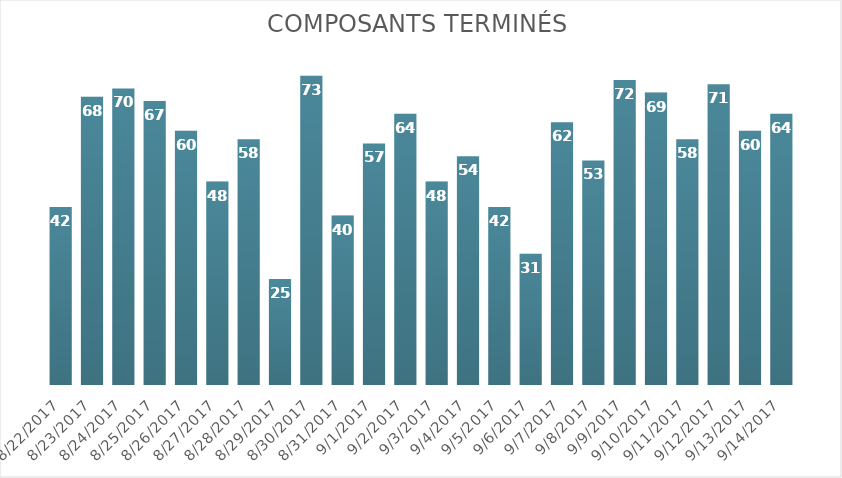
| Category | Composants terminés |
|---|---|
| 8/22/17 | 42 |
| 8/23/17 | 68 |
| 8/24/17 | 70 |
| 8/25/17 | 67 |
| 8/26/17 | 60 |
| 8/27/17 | 48 |
| 8/28/17 | 58 |
| 8/29/17 | 25 |
| 8/30/17 | 73 |
| 8/31/17 | 40 |
| 9/1/17 | 57 |
| 9/2/17 | 64 |
| 9/3/17 | 48 |
| 9/4/17 | 54 |
| 9/5/17 | 42 |
| 9/6/17 | 31 |
| 9/7/17 | 62 |
| 9/8/17 | 53 |
| 9/9/17 | 72 |
| 9/10/17 | 69 |
| 9/11/17 | 58 |
| 9/12/17 | 71 |
| 9/13/17 | 60 |
| 9/14/17 | 64 |